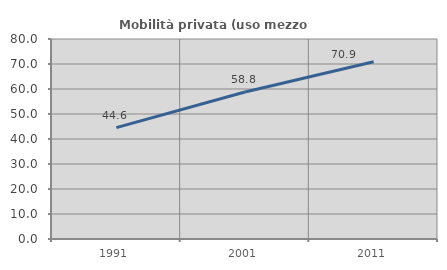
| Category | Mobilità privata (uso mezzo privato) |
|---|---|
| 1991.0 | 44.554 |
| 2001.0 | 58.789 |
| 2011.0 | 70.932 |